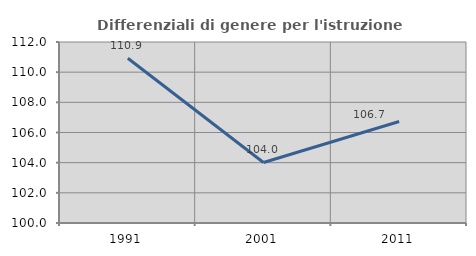
| Category | Differenziali di genere per l'istruzione superiore |
|---|---|
| 1991.0 | 110.927 |
| 2001.0 | 104.012 |
| 2011.0 | 106.732 |